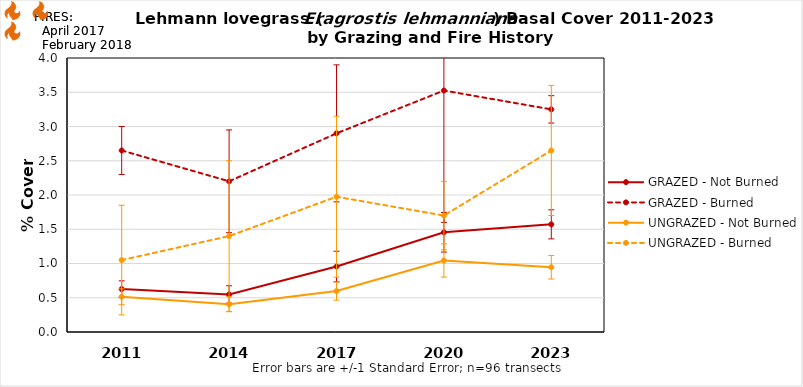
| Category | GRAZED - Not Burned | GRAZED - Burned | UNGRAZED - Not Burned | UNGRAZED - Burned |
|---|---|---|---|---|
| 2011.0 | 0.626 | 2.65 | 0.514 | 1.05 |
| 2014.0 | 0.549 | 2.2 | 0.405 | 1.4 |
| 2017.0 | 0.956 | 2.9 | 0.598 | 1.975 |
| 2020.0 | 1.456 | 3.525 | 1.044 | 1.7 |
| 2023.0 | 1.571 | 3.25 | 0.945 | 2.65 |